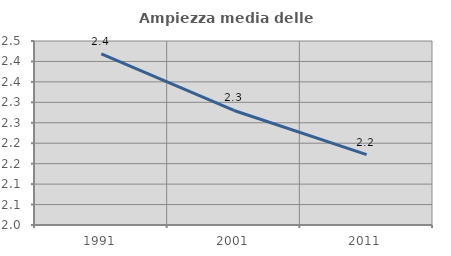
| Category | Ampiezza media delle famiglie |
|---|---|
| 1991.0 | 2.418 |
| 2001.0 | 2.28 |
| 2011.0 | 2.172 |